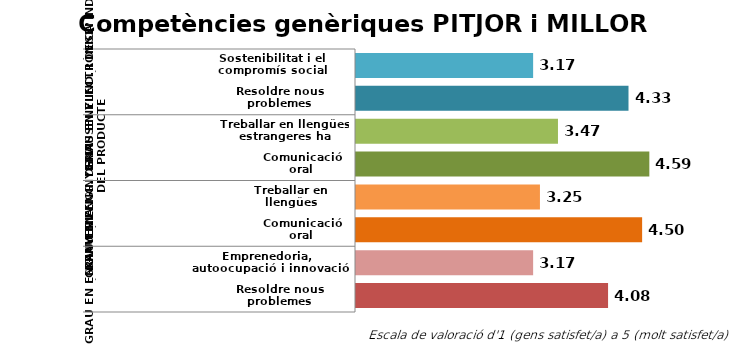
| Category | Series 1 |
|---|---|
| 0 | 3.167 |
| 1 | 4.333 |
| 2 | 3.471 |
| 3 | 4.588 |
| 4 | 3.25 |
| 5 | 4.5 |
| 6 | 3.167 |
| 7 | 4.083 |